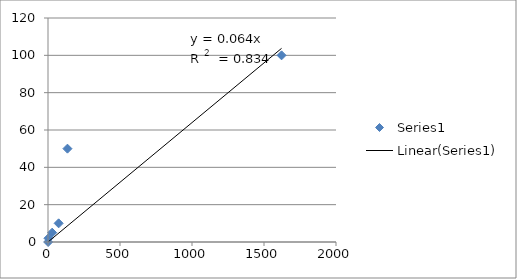
| Category | Series 0 |
|---|---|
| 1.0 | 0 |
| 3.0 | 2 |
| 29.0 | 5 |
| 74.0 | 10 |
| 135.0 | 50 |
| 1622.0 | 100 |